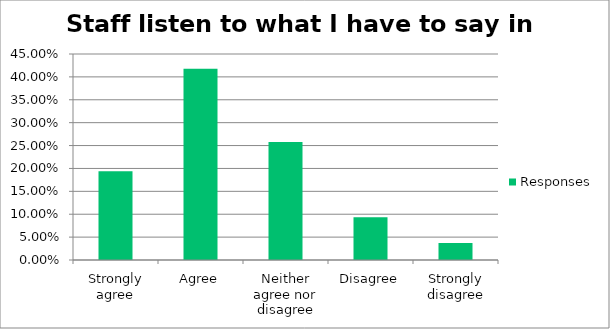
| Category | Responses |
|---|---|
| Strongly agree | 0.194 |
| Agree | 0.418 |
| Neither agree nor disagree | 0.258 |
| Disagree | 0.093 |
| Strongly disagree | 0.037 |